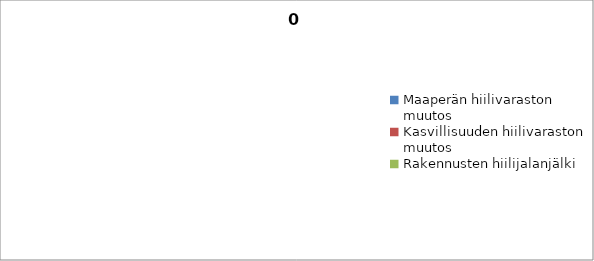
| Category | Series 0 | Series 1 |
|---|---|---|
| Maaperän hiilivaraston muutos | 0 | 0 |
| Kasvillisuuden hiilivaraston muutos | 0 | 0 |
| Rakennusten hiilijalanjälki | 0 | 0 |